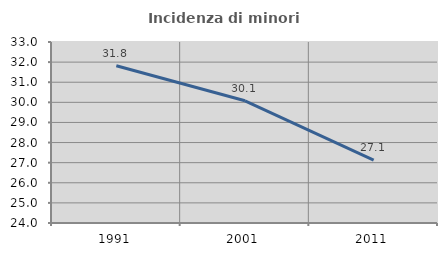
| Category | Incidenza di minori stranieri |
|---|---|
| 1991.0 | 31.818 |
| 2001.0 | 30.075 |
| 2011.0 | 27.129 |